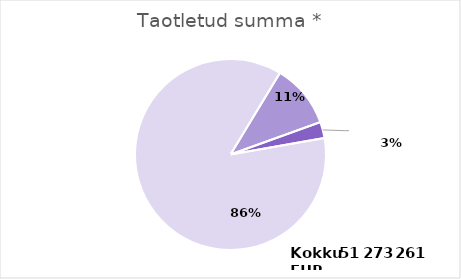
| Category | Taotletud summa |
|---|---|
| PRG | 44325226 |
| PSG | 5547275 |
| PUTJD | 1400760 |